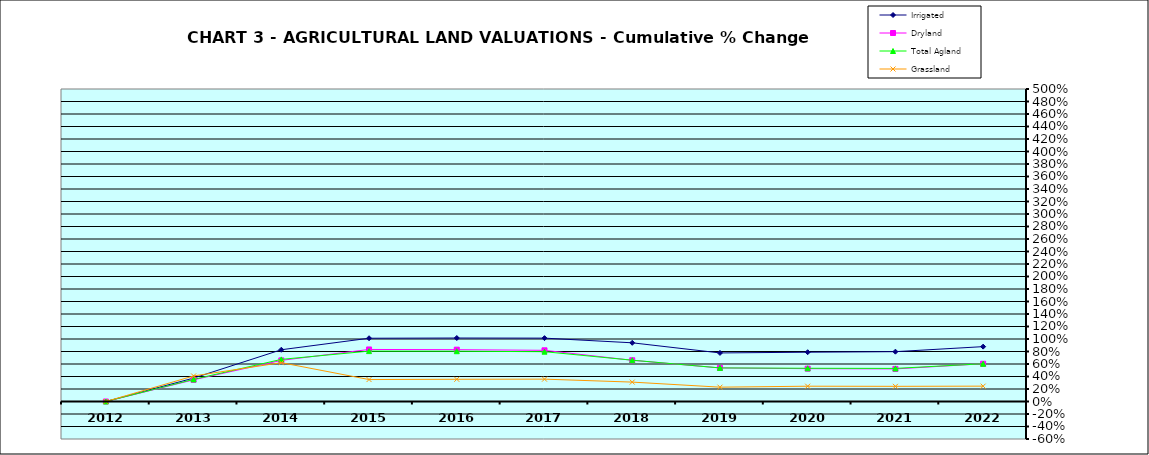
| Category | Irrigated | Dryland | Total Agland | Grassland |
|---|---|---|---|---|
| 2012.0 | 0 | 0 | 0 | 0 |
| 2013.0 | 0.374 | 0.347 | 0.354 | 0.409 |
| 2014.0 | 0.828 | 0.658 | 0.674 | 0.621 |
| 2015.0 | 1.012 | 0.833 | 0.806 | 0.351 |
| 2016.0 | 1.016 | 0.829 | 0.805 | 0.355 |
| 2017.0 | 1.014 | 0.819 | 0.797 | 0.358 |
| 2018.0 | 0.939 | 0.66 | 0.661 | 0.31 |
| 2019.0 | 0.777 | 0.537 | 0.537 | 0.229 |
| 2020.0 | 0.789 | 0.525 | 0.532 | 0.245 |
| 2021.0 | 0.797 | 0.521 | 0.53 | 0.243 |
| 2022.0 | 0.878 | 0.604 | 0.604 | 0.246 |